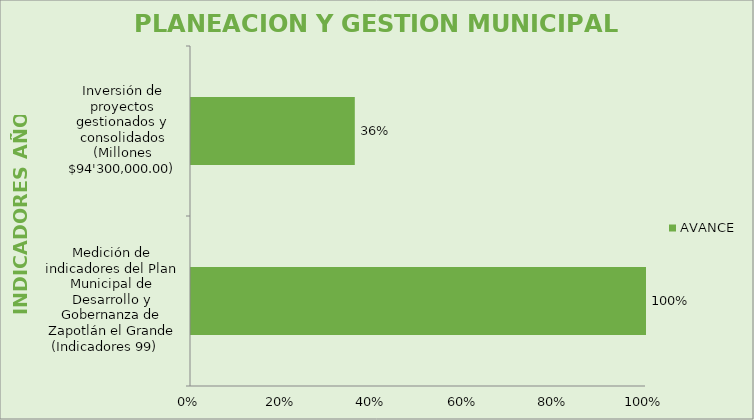
| Category | AVANCE |
|---|---|
| Medición de indicadores del Plan Municipal de Desarrollo y Gobernanza de Zapotlán el Grande (Indicadores 99)    | 1 |
| Inversión de proyectos gestionados y consolidados (Millones $94'300,000.00) | 0.36 |